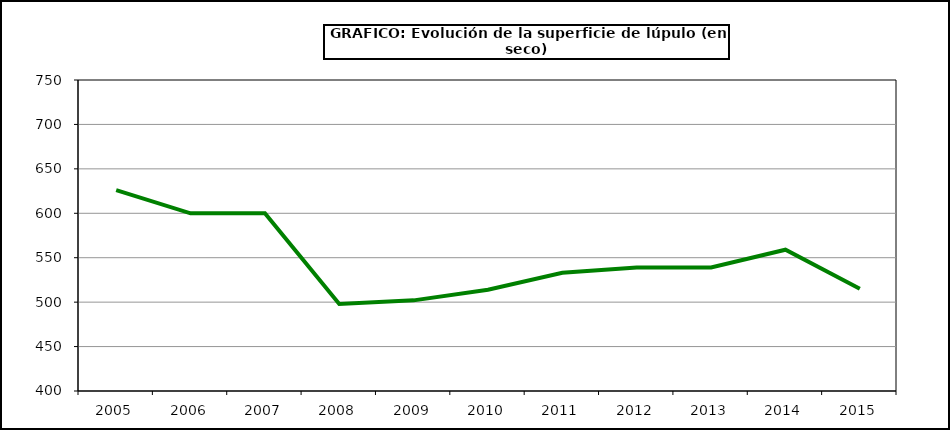
| Category | Superficie |
|---|---|
| 2005.0 | 626 |
| 2006.0 | 600 |
| 2007.0 | 600 |
| 2008.0 | 498 |
| 2009.0 | 502 |
| 2010.0 | 514 |
| 2011.0 | 533 |
| 2012.0 | 539 |
| 2013.0 | 539 |
| 2014.0 | 559 |
| 2015.0 | 515 |